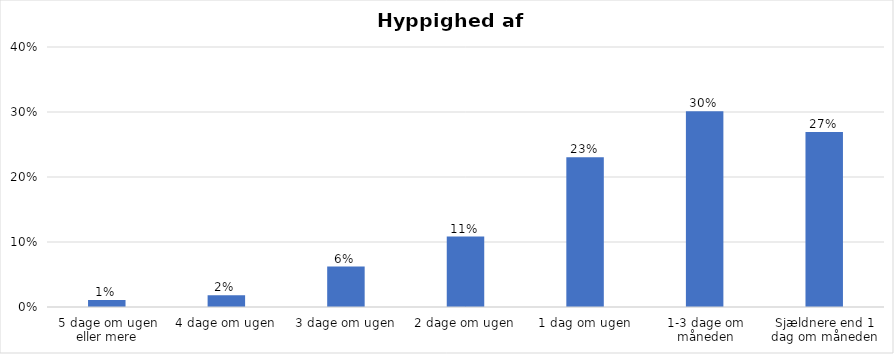
| Category | % |
|---|---|
| 5 dage om ugen eller mere | 0.011 |
| 4 dage om ugen | 0.018 |
| 3 dage om ugen | 0.062 |
| 2 dage om ugen | 0.108 |
| 1 dag om ugen | 0.23 |
| 1-3 dage om måneden | 0.301 |
| Sjældnere end 1 dag om måneden | 0.269 |